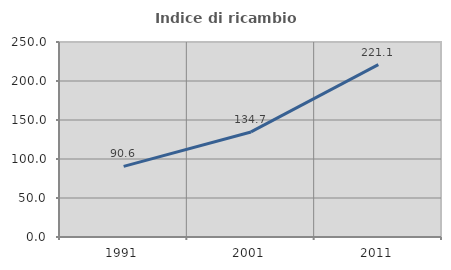
| Category | Indice di ricambio occupazionale  |
|---|---|
| 1991.0 | 90.583 |
| 2001.0 | 134.682 |
| 2011.0 | 221.084 |